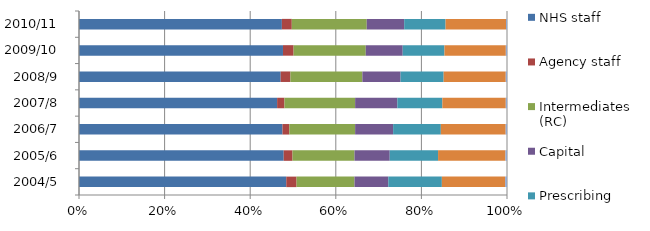
| Category | NHS staff | Agency staff | Intermediates (RC) | Capital | Prescribing | Primary Care | DH Administration |
|---|---|---|---|---|---|---|---|
| 2004/5 | 31334252.48 | 1557282.449 | 8757990 | 5115514.281 | 8094174.944 | 9569836 | 278000 |
| 2005/6 | 33926746.315 | 1459935.5 | 10271344 | 5839664.371 | 8013483.226 | 11162141 | 262000 |
| 2006/7 | 35177509.125 | 1185244 | 11378727 | 6568362.68 | 8250323.893 | 11209422 | 229000 |
| 2007/8 | 36539983.702 | 1354520.298 | 13036200 | 7784592.073 | 8303500.918 | 11697639 | 226000 |
| 2008/9 | 39213453.649 | 1895451.884 | 13991803 | 7426030.918 | 8376264.432 | 12074672 | 242958 |
| 2009/10 | 42145100.102 | 2195295.391 | 14911074 | 7635390.129 | 8621421.13 | 12683418 | 241608 |
| 2010/11 | 43513839 | 2127889 | 16077609 | 8025361 | 8880735.344 | 12962081 | 212245 |